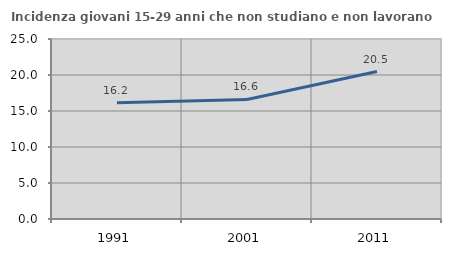
| Category | Incidenza giovani 15-29 anni che non studiano e non lavorano  |
|---|---|
| 1991.0 | 16.159 |
| 2001.0 | 16.601 |
| 2011.0 | 20.48 |